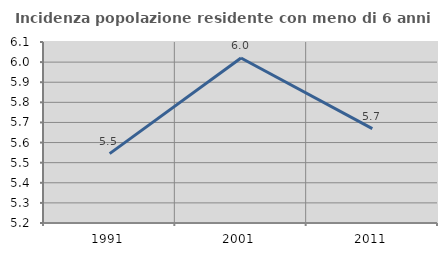
| Category | Incidenza popolazione residente con meno di 6 anni |
|---|---|
| 1991.0 | 5.545 |
| 2001.0 | 6.02 |
| 2011.0 | 5.669 |